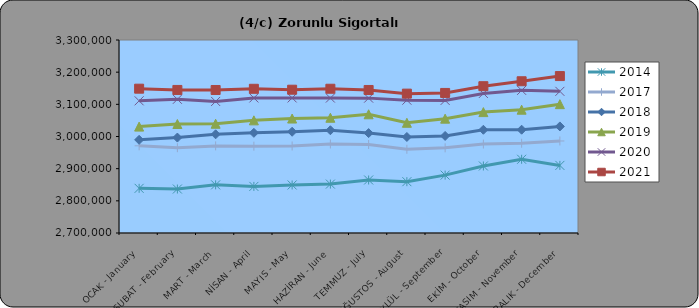
| Category | 2014 | 2017 | 2018 | 2019 | 2020 | 2021 |
|---|---|---|---|---|---|---|
| OCAK - January |  | 2971096 | 2989631 | 3030725 | 3110922 | 3148682 |
| ŞUBAT - February |  | 2965218 | 2996690 | 3038819 | 3115640 | 3144723 |
| MART - March |  | 2970810 | 3006828 | 3039681 | 3108959 | 3144608 |
| NİSAN - April |  | 2969930 | 3011373 | 3050182 | 3119852 | 3148326 |
| MAYIS - May |  | 2970555 | 3014740 | 3055833 | 3119932 | 3145479 |
| HAZİRAN - June |  | 2976758 | 3019444 | 3058258 | 3119541 | 3148469 |
| TEMMUZ - July |  | 2975092 | 3010588 | 3069057 | 3119297 | 3144628 |
| AĞUSTOS - August |  | 2960311 | 2998531 | 3042624 | 3112875 | 3133244 |
| EYLÜL - September |  | 2964754 | 3001713 | 3055436 | 3112213 | 3135413 |
| EKİM - October |  | 2976497 | 3020919 | 3075826 | 3133911 | 3156402 |
| KASIM - November |  | 2979048 | 3021127 | 3083315 | 3143475 | 3171761 |
| ARALIK - December |  | 2986088 | 3031311 | 3100511 | 3140410 | 3187862 |